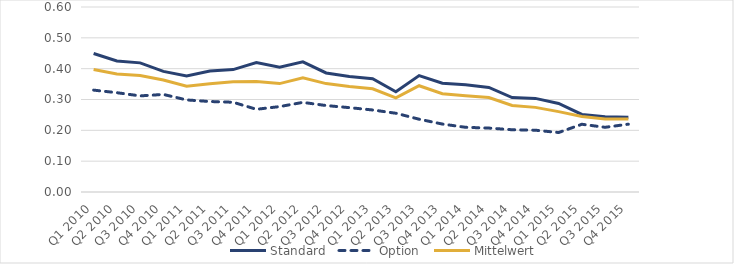
| Category | Standard | Option | Mittelwert |
|---|---|---|---|
| Q1 2010 | 0.449 | 0.33 | 0.397 |
| Q2 2010 | 0.425 | 0.322 | 0.382 |
| Q3 2010 | 0.419 | 0.312 | 0.378 |
| Q4 2010 | 0.391 | 0.316 | 0.363 |
| Q1 2011 | 0.376 | 0.299 | 0.343 |
| Q2 2011 | 0.392 | 0.293 | 0.351 |
| Q3 2011 | 0.397 | 0.291 | 0.357 |
| Q4 2011 | 0.42 | 0.268 | 0.358 |
| Q1 2012 | 0.405 | 0.277 | 0.352 |
| Q2 2012 | 0.422 | 0.291 | 0.37 |
| Q3 2012 | 0.386 | 0.28 | 0.352 |
| Q4 2012 | 0.375 | 0.274 | 0.342 |
| Q1 2013 | 0.367 | 0.266 | 0.335 |
| Q2 2013 | 0.325 | 0.255 | 0.305 |
| Q3 2013 | 0.378 | 0.236 | 0.345 |
| Q4 2013 | 0.353 | 0.22 | 0.319 |
| Q1 2014 | 0.348 | 0.21 | 0.312 |
| Q2 2014 | 0.339 | 0.207 | 0.306 |
| Q3 2014 | 0.306 | 0.202 | 0.281 |
| Q4 2014 | 0.304 | 0.2 | 0.274 |
| Q1 2015 | 0.287 | 0.193 | 0.261 |
| Q2 2015 | 0.252 | 0.22 | 0.245 |
| Q3 2015 | 0.244 | 0.21 | 0.237 |
| Q4 2015 | 0.242 | 0.22 | 0.237 |